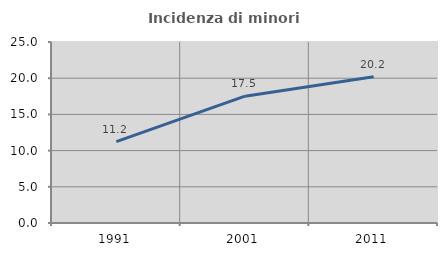
| Category | Incidenza di minori stranieri |
|---|---|
| 1991.0 | 11.246 |
| 2001.0 | 17.522 |
| 2011.0 | 20.197 |